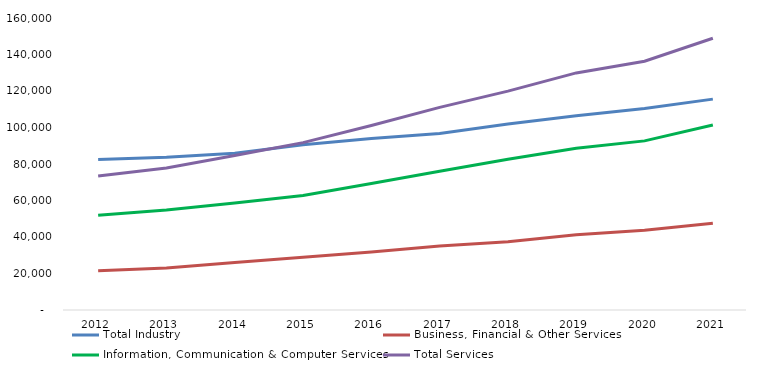
| Category | Total Industry | Business, Financial & Other Services | Information, Communication & Computer Services | Total Services |
|---|---|---|---|---|
| 2012.0 | 82484 | 21527 | 51852 | 73379 |
| 2013.0 | 83714 | 22966 | 54791 | 77757 |
| 2014.0 | 85842 | 26017 | 58593 | 84610 |
| 2015.0 | 90537 | 28943 | 62762 | 91705 |
| 2016.0 | 93934 | 31749 | 69370 | 101119 |
| 2017.0 | 96732 | 35006 | 76010 | 111016 |
| 2018.0 | 101958 | 37370 | 82568 | 119938 |
| 2019.0 | 106397 | 41274 | 88634 | 129908 |
| 2020.0 | 110467 | 43653 | 92666 | 136319 |
| 2021.0 | 115552 | 47586 | 101326 | 148912 |